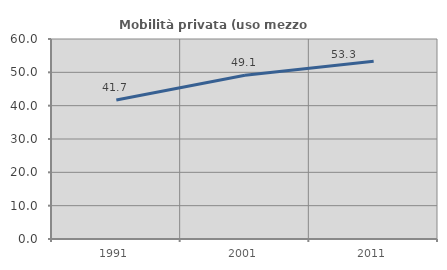
| Category | Mobilità privata (uso mezzo privato) |
|---|---|
| 1991.0 | 41.692 |
| 2001.0 | 49.103 |
| 2011.0 | 53.339 |